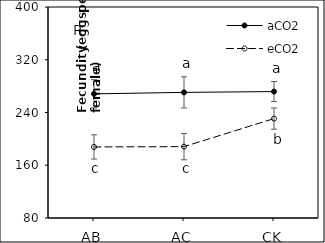
| Category | aCO2 | eCO2 |
|---|---|---|
| AB | 268.25 | 187.75 |
| AC | 270.5 | 188.25 |
| CK | 271.75 | 230.75 |